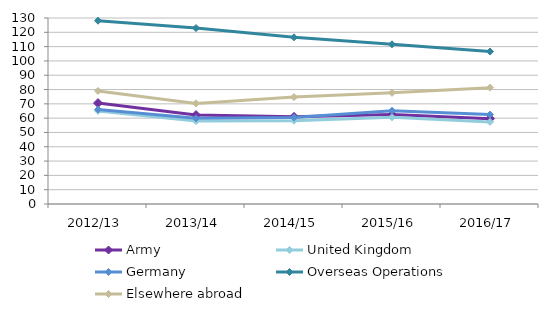
| Category | Army | United Kingdom | Germany | Overseas Operations | Elsewhere abroad |
|---|---|---|---|---|---|
| 2012/13 | 70.549 | 65.078 | 65.999 | 128.109 | 79.009 |
| 2013/14 | 62.189 | 57.972 | 59.861 | 122.966 | 70.308 |
| 2014/15 | 60.923 | 58.19 | 60.393 | 116.5 | 74.711 |
| 2015/16 | 62.519 | 60.56 | 65.232 | 111.606 | 77.686 |
| 2016/17 | 59.663 | 57.36 | 62.51 | 106.554 | 81.333 |